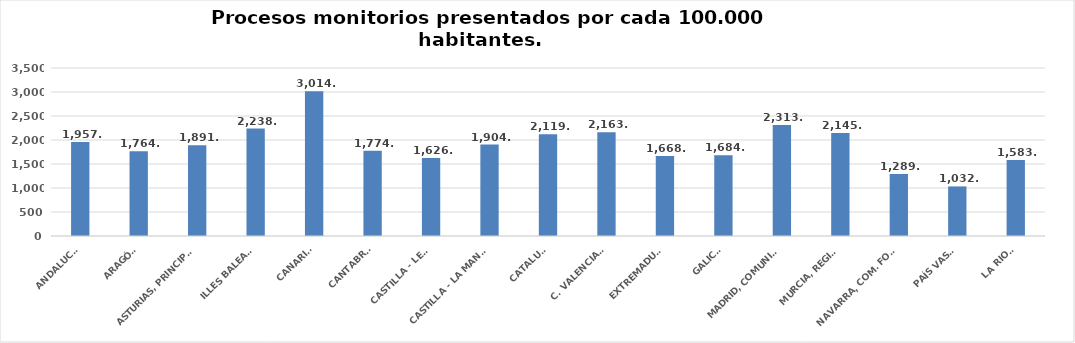
| Category | Series 0 |
|---|---|
| ANDALUCÍA | 1957.415 |
| ARAGÓN | 1764.287 |
| ASTURIAS, PRINCIPADO | 1891.536 |
| ILLES BALEARS | 2238.032 |
| CANARIAS | 3014.647 |
| CANTABRIA | 1774.507 |
| CASTILLA - LEÓN | 1626.543 |
| CASTILLA - LA MANCHA | 1904.372 |
| CATALUÑA | 2119.02 |
| C. VALENCIANA | 2163.882 |
| EXTREMADURA | 1668.127 |
| GALICIA | 1684.022 |
| MADRID, COMUNIDAD | 2313.529 |
| MURCIA, REGIÓN | 2145.014 |
| NAVARRA, COM. FORAL | 1289.231 |
| PAÍS VASCO | 1032.89 |
| LA RIOJA | 1583.034 |